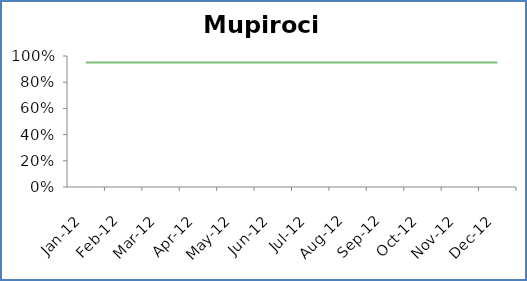
| Category | Mupirocin | Median | Goal |
|---|---|---|---|
| 2012-01-01 |  | 0 | 0.95 |
| 2012-02-01 |  | 0 | 0.95 |
| 2012-03-01 |  | 0 | 0.95 |
| 2012-04-01 |  | 0 | 0.95 |
| 2012-05-01 |  | 0 | 0.95 |
| 2012-06-01 |  | 0 | 0.95 |
| 2012-07-01 |  | 0 | 0.95 |
| 2012-08-01 |  | 0 | 0.95 |
| 2012-09-01 |  | 0 | 0.95 |
| 2012-10-01 |  | 0 | 0.95 |
| 2012-11-01 |  | 0 | 0.95 |
| 2012-12-01 |  | 0 | 0.95 |